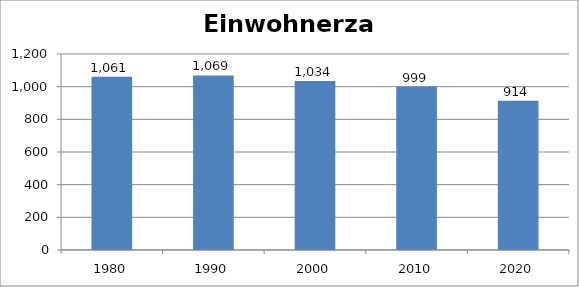
| Category | Einwohnerzahl |
|---|---|
| 1980.0 | 1061 |
| 1990.0 | 1069 |
| 2000.0 | 1034 |
| 2010.0 | 999 |
| 2020.0 | 914 |